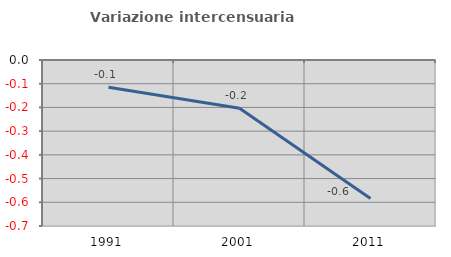
| Category | Variazione intercensuaria annua |
|---|---|
| 1991.0 | -0.115 |
| 2001.0 | -0.204 |
| 2011.0 | -0.584 |